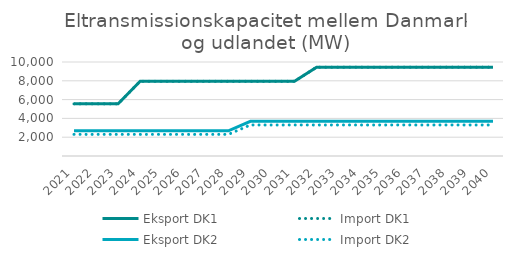
| Category | Eksport DK1 | Import DK1 | Eksport DK2 | Import DK2 |
|---|---|---|---|---|
| 2021.0 | 5547 | 5547 | 2685 | 2300 |
| 2022.0 | 5547 | 5547 | 2685 | 2300 |
| 2023.0 | 5547 | 5547 | 2685 | 2300 |
| 2024.0 | 7947 | 7947 | 2685 | 2300 |
| 2025.0 | 7947 | 7947 | 2685 | 2300 |
| 2026.0 | 7947 | 7947 | 2685 | 2300 |
| 2027.0 | 7947 | 7947 | 2685 | 2300 |
| 2028.0 | 7947 | 7947 | 2685 | 2300 |
| 2029.0 | 7947 | 7947 | 3685 | 3300 |
| 2030.0 | 7947 | 7947 | 3685 | 3300 |
| 2031.0 | 7947 | 7947 | 3685 | 3300 |
| 2032.0 | 9447 | 9447 | 3685 | 3300 |
| 2033.0 | 9447 | 9447 | 3685 | 3300 |
| 2034.0 | 9447 | 9447 | 3685 | 3300 |
| 2035.0 | 9447 | 9447 | 3685 | 3300 |
| 2036.0 | 9447 | 9447 | 3685 | 3300 |
| 2037.0 | 9447 | 9447 | 3685 | 3300 |
| 2038.0 | 9447 | 9447 | 3685 | 3300 |
| 2039.0 | 9447 | 9447 | 3685 | 3300 |
| 2040.0 | 9447 | 9447 | 3685 | 3300 |